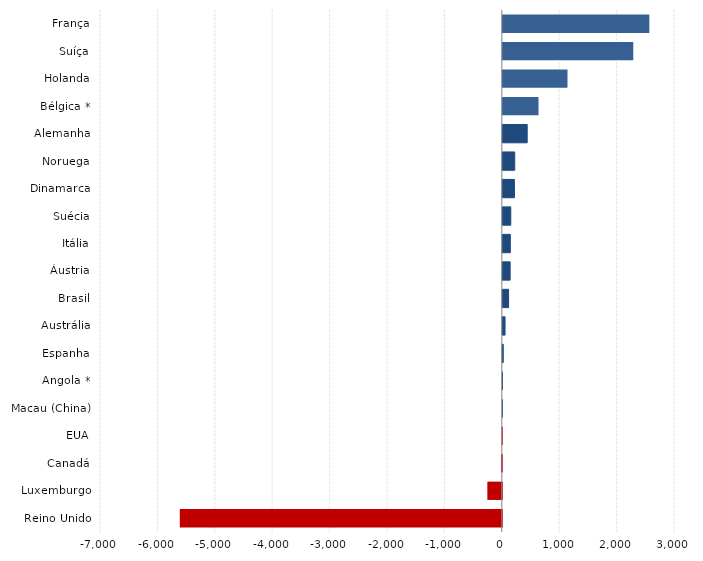
| Category | Series 0 |
|---|---|
| Reino Unido | -5610 |
| Luxemburgo | -252 |
| Canadá | -15 |
| EUA | -4 |
| Macau (China) | 2 |
| Angola * | 4 |
| Espanha | 8 |
| Austrália | 39 |
| Brasil | 101 |
| Áustria | 128 |
| Itália | 131 |
| Suécia | 139 |
| Dinamarca | 203 |
| Noruega | 208 |
| Alemanha | 425 |
| Bélgica * | 622 |
| Holanda | 1127 |
| Suíça | 2273 |
| França | 2553 |